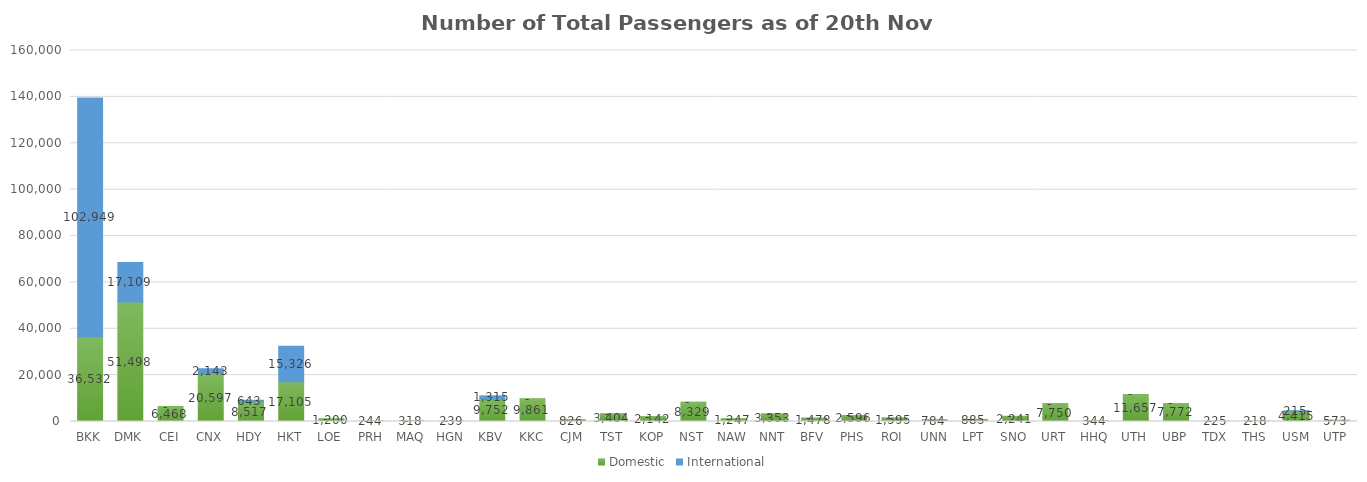
| Category | Domestic | International |
|---|---|---|
| BKK | 36532 | 102949 |
| DMK | 51498 | 17109 |
| CEI | 6468 | 0 |
| CNX | 20597 | 2143 |
| HDY | 8517 | 643 |
| HKT | 17105 | 15326 |
| LOE | 1200 | 0 |
| PRH | 244 | 0 |
| MAQ | 318 | 0 |
| HGN | 239 | 0 |
| KBV | 9752 | 1315 |
| KKC | 9861 | 0 |
| CJM | 826 | 0 |
| TST | 3404 | 0 |
| KOP | 2142 | 0 |
| NST | 8329 | 0 |
| NAW | 1247 | 0 |
| NNT | 3353 | 0 |
| BFV | 1478 | 0 |
| PHS | 2596 | 0 |
| ROI | 1595 | 0 |
| UNN | 784 | 0 |
| LPT | 885 | 0 |
| SNO | 2241 | 0 |
| URT | 7750 | 0 |
| HHQ | 344 | 0 |
| UTH | 11657 | 0 |
| UBP | 7772 | 0 |
| TDX | 225 | 0 |
| THS | 218 | 0 |
| USM | 4415 | 215 |
| UTP | 573 | 0 |